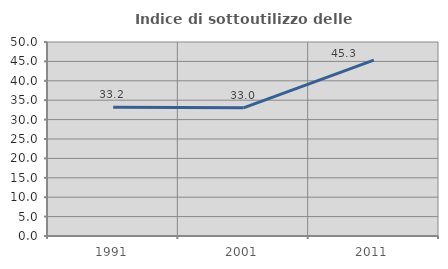
| Category | Indice di sottoutilizzo delle abitazioni  |
|---|---|
| 1991.0 | 33.186 |
| 2001.0 | 33.032 |
| 2011.0 | 45.333 |